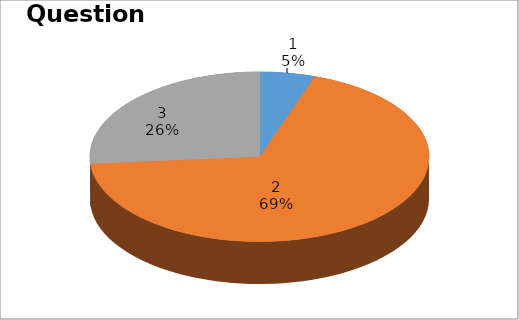
| Category | Series 0 |
|---|---|
| 0 | 1 |
| 1 | 13 |
| 2 | 5 |